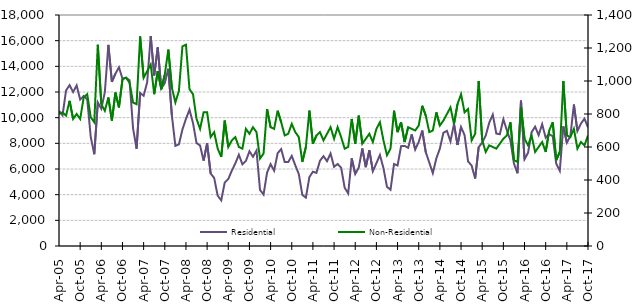
| Category | Residential |
|---|---|
| 2005-04-01 | 10540 |
| 2005-05-01 | 10180 |
| 2005-06-01 | 12120 |
| 2005-07-01 | 12530 |
| 2005-08-01 | 12000 |
| 2005-09-01 | 12510 |
| 2005-10-01 | 11410 |
| 2005-11-01 | 11690 |
| 2005-12-01 | 11430 |
| 2006-01-01 | 8500 |
| 2006-02-01 | 7150 |
| 2006-03-01 | 11180 |
| 2006-04-01 | 10690 |
| 2006-05-01 | 11990 |
| 2006-06-01 | 15670 |
| 2006-07-01 | 12790 |
| 2006-08-01 | 13430 |
| 2006-09-01 | 13930 |
| 2006-10-01 | 13030 |
| 2006-11-01 | 13120 |
| 2006-12-01 | 12920 |
| 2007-01-01 | 9170 |
| 2007-02-01 | 7580 |
| 2007-03-01 | 11920 |
| 2007-04-01 | 11700 |
| 2007-05-01 | 12750 |
| 2007-06-01 | 16360 |
| 2007-07-01 | 13290 |
| 2007-08-01 | 15480 |
| 2007-09-01 | 12270 |
| 2007-10-01 | 12700 |
| 2007-11-01 | 13810 |
| 2007-12-01 | 10180 |
| 2008-01-01 | 7800 |
| 2008-02-01 | 7920 |
| 2008-03-01 | 9080 |
| 2008-04-01 | 9910 |
| 2008-05-01 | 10620 |
| 2008-06-01 | 9580 |
| 2008-07-01 | 8020 |
| 2008-08-01 | 7830 |
| 2008-09-01 | 6650 |
| 2008-10-01 | 8000 |
| 2008-11-01 | 5650 |
| 2008-12-01 | 5300 |
| 2009-01-01 | 3920 |
| 2009-02-01 | 3560 |
| 2009-03-01 | 4950 |
| 2009-04-01 | 5220 |
| 2009-05-01 | 5870 |
| 2009-06-01 | 6440 |
| 2009-07-01 | 7110 |
| 2009-08-01 | 6370 |
| 2009-09-01 | 6630 |
| 2009-10-01 | 7380 |
| 2009-11-01 | 6950 |
| 2009-12-01 | 7440 |
| 2010-01-01 | 4370 |
| 2010-02-01 | 4010 |
| 2010-03-01 | 5720 |
| 2010-04-01 | 6380 |
| 2010-05-01 | 5870 |
| 2010-06-01 | 7230 |
| 2010-07-01 | 7550 |
| 2010-08-01 | 6540 |
| 2010-09-01 | 6540 |
| 2010-10-01 | 7020 |
| 2010-11-01 | 6290 |
| 2010-12-01 | 5600 |
| 2011-01-01 | 3980 |
| 2011-02-01 | 3770 |
| 2011-03-01 | 5370 |
| 2011-04-01 | 5790 |
| 2011-05-01 | 5700 |
| 2011-06-01 | 6640 |
| 2011-07-01 | 7000 |
| 2011-08-01 | 6610 |
| 2011-09-01 | 7210 |
| 2011-10-01 | 6170 |
| 2011-11-01 | 6390 |
| 2011-12-01 | 6110 |
| 2012-01-01 | 4540 |
| 2012-02-01 | 4100 |
| 2012-03-01 | 6830 |
| 2012-04-01 | 5610 |
| 2012-05-01 | 6110 |
| 2012-06-01 | 7600 |
| 2012-07-01 | 6140 |
| 2012-08-01 | 7460 |
| 2012-09-01 | 5830 |
| 2012-10-01 | 6450 |
| 2012-11-01 | 7090 |
| 2012-12-01 | 6070 |
| 2013-01-01 | 4610 |
| 2013-02-01 | 4380 |
| 2013-03-01 | 6390 |
| 2013-04-01 | 6270 |
| 2013-05-01 | 7780 |
| 2013-06-01 | 7800 |
| 2013-07-01 | 7650 |
| 2013-08-01 | 8700 |
| 2013-09-01 | 7520 |
| 2013-10-01 | 8110 |
| 2013-11-01 | 9000 |
| 2013-12-01 | 7310 |
| 2014-01-01 | 6500 |
| 2014-02-01 | 5680 |
| 2014-03-01 | 6830 |
| 2014-04-01 | 7590 |
| 2014-05-01 | 8830 |
| 2014-06-01 | 8970 |
| 2014-07-01 | 8160 |
| 2014-08-01 | 9500 |
| 2014-09-01 | 7870 |
| 2014-10-01 | 9270 |
| 2014-11-01 | 8640 |
| 2014-12-01 | 6590 |
| 2015-01-01 | 6270 |
| 2015-02-01 | 5260 |
| 2015-03-01 | 7700 |
| 2015-04-01 | 8060 |
| 2015-05-01 | 8600 |
| 2015-06-01 | 9610 |
| 2015-07-01 | 10240 |
| 2015-08-01 | 8760 |
| 2015-09-01 | 8710 |
| 2015-10-01 | 9880 |
| 2015-11-01 | 9000 |
| 2015-12-01 | 8230 |
| 2016-01-01 | 6430 |
| 2016-02-01 | 5670 |
| 2016-03-01 | 11330 |
| 2016-04-01 | 6760 |
| 2016-05-01 | 7260 |
| 2016-06-01 | 8860 |
| 2016-07-01 | 9300 |
| 2016-08-01 | 8640 |
| 2016-09-01 | 9490 |
| 2016-10-01 | 8440 |
| 2016-11-01 | 8710 |
| 2016-12-01 | 8560 |
| 2017-01-01 | 6400 |
| 2017-02-01 | 5860 |
| 2017-03-01 | 9320 |
| 2017-04-01 | 8050 |
| 2017-05-01 | 8570 |
| 2017-06-01 | 11020 |
| 2017-07-01 | 8960 |
| 2017-08-01 | 9540 |
| 2017-09-01 | 9920 |
| 2017-10-01 | 9240 |